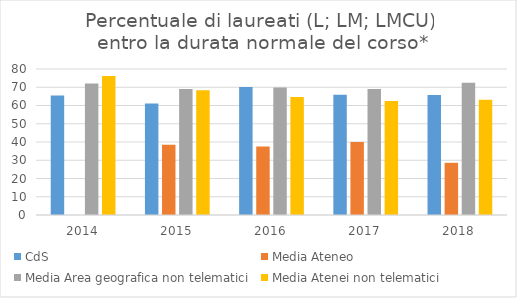
| Category | CdS | Media Ateneo | Media Area geografica non telematici | Media Atenei non telematici |
|---|---|---|---|---|
| 2014.0 | 65.5 | 0 | 72 | 76.1 |
| 2015.0 | 61.1 | 38.5 | 69.1 | 68.3 |
| 2016.0 | 70.1 | 37.5 | 69.9 | 64.7 |
| 2017.0 | 65.9 | 40 | 69.1 | 62.4 |
| 2018.0 | 65.8 | 28.6 | 72.4 | 63.1 |